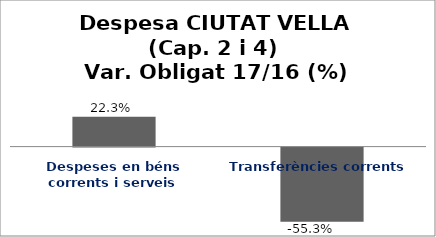
| Category | Series 0 |
|---|---|
| Despeses en béns corrents i serveis | 0.223 |
| Transferències corrents | -0.553 |